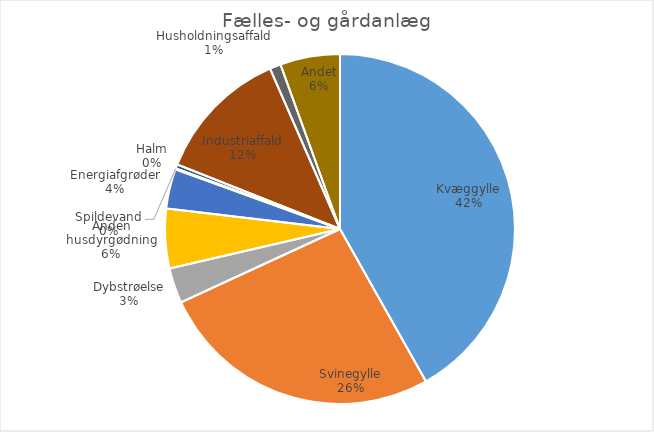
| Category | Series 0 |
|---|---|
| Kvæggylle | 2877052.61 |
| Svinegylle | 1808916.05 |
| Dybstrøelse | 223921.36 |
| Anden husdyrgødning | 378434.29 |
| Energiafgrøder | 252188.6 |
| Spildevand | 6055.3 |
| Halm | 26148 |
| Industriaffald | 855855.71 |
| Husholdningsaffald | 70218.13 |
| Andet | 380205.64 |